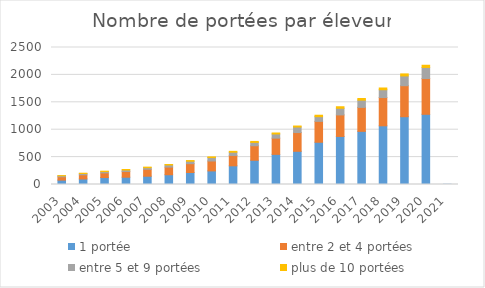
| Category | 1 portée | entre 2 et 4 portées | entre 5 et 9 portées | plus de 10 portées |
|---|---|---|---|---|
| 2003.0 | 80 | 61 | 18 | 3 |
| 2004.0 | 101 | 76 | 24 | 5 |
| 2005.0 | 127 | 85 | 24 | 7 |
| 2006.0 | 133 | 105 | 26 | 10 |
| 2007.0 | 151 | 128 | 28 | 10 |
| 2008.0 | 178 | 140 | 38 | 9 |
| 2009.0 | 219 | 161 | 45 | 12 |
| 2010.0 | 248 | 181 | 63 | 12 |
| 2011.0 | 341 | 189 | 59 | 16 |
| 2012.0 | 442 | 265 | 61 | 18 |
| 2013.0 | 550 | 296 | 76 | 18 |
| 2014.0 | 606 | 342 | 101 | 18 |
| 2015.0 | 771 | 381 | 86 | 26 |
| 2016.0 | 877 | 393 | 121 | 28 |
| 2017.0 | 970 | 437 | 132 | 30 |
| 2018.0 | 1071 | 516 | 142 | 32 |
| 2019.0 | 1237 | 566 | 178 | 37 |
| 2020.0 | 1281 | 653 | 202 | 40 |
| 2021.0 | 4 | 0 | 0 | 0 |